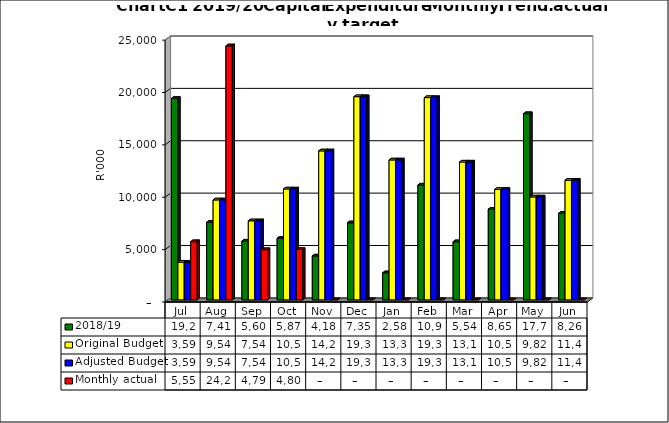
| Category | 2018/19 | Original Budget | Adjusted Budget | Monthly actual |
|---|---|---|---|---|
| Jul | 19231011.37 | 3597000 | 3597000 | 5554740.23 |
| Aug | 7413792.52 | 9540000 | 9540000 | 24246351.16 |
| Sep | 5606695.82 | 7545000 | 7545000 | 4790238.71 |
| Oct | 5872546.52 | 10583000 | 10583000 | 4804471.47 |
| Nov | 4185356.82 | 14220000 | 14220000 | 0 |
| Dec | 7353836.19 | 19396000 | 19396000 | 0 |
| Jan | 2583015.59 | 13356000 | 13356000 | 0 |
| Feb | 10959701.7 | 19309000 | 19309000 | 0 |
| Mar | 5548374.54 | 13155000 | 13155000 | 0 |
| Apr | 8654474.54 | 10547000 | 10547000 | 0 |
| May | 17774802.17 | 9821000 | 9821000 | 0 |
| Jun | 8264280 | 11417000 | 11417000 | 0 |